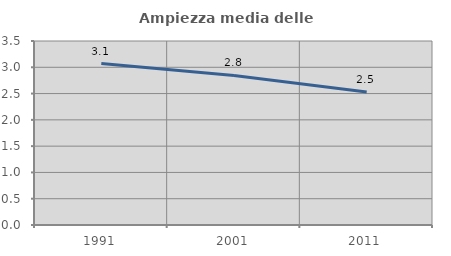
| Category | Ampiezza media delle famiglie |
|---|---|
| 1991.0 | 3.071 |
| 2001.0 | 2.844 |
| 2011.0 | 2.53 |